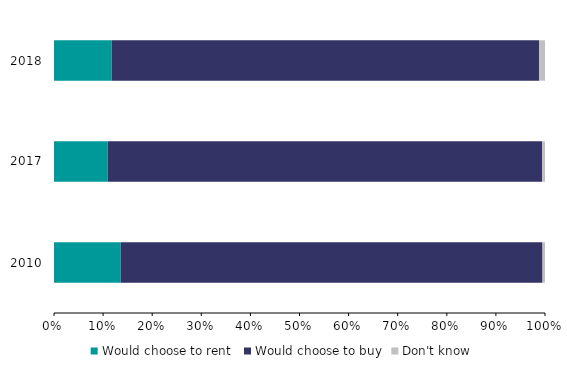
| Category | Would choose to rent  | Would choose to buy | Don't know |
|---|---|---|---|
| 2010.0 | 13.594 | 85.905 | 0.501 |
| 2017.0 | 10.937 | 88.495 | 0.568 |
| 2018.0 | 11.73 | 87.099 | 1.171 |